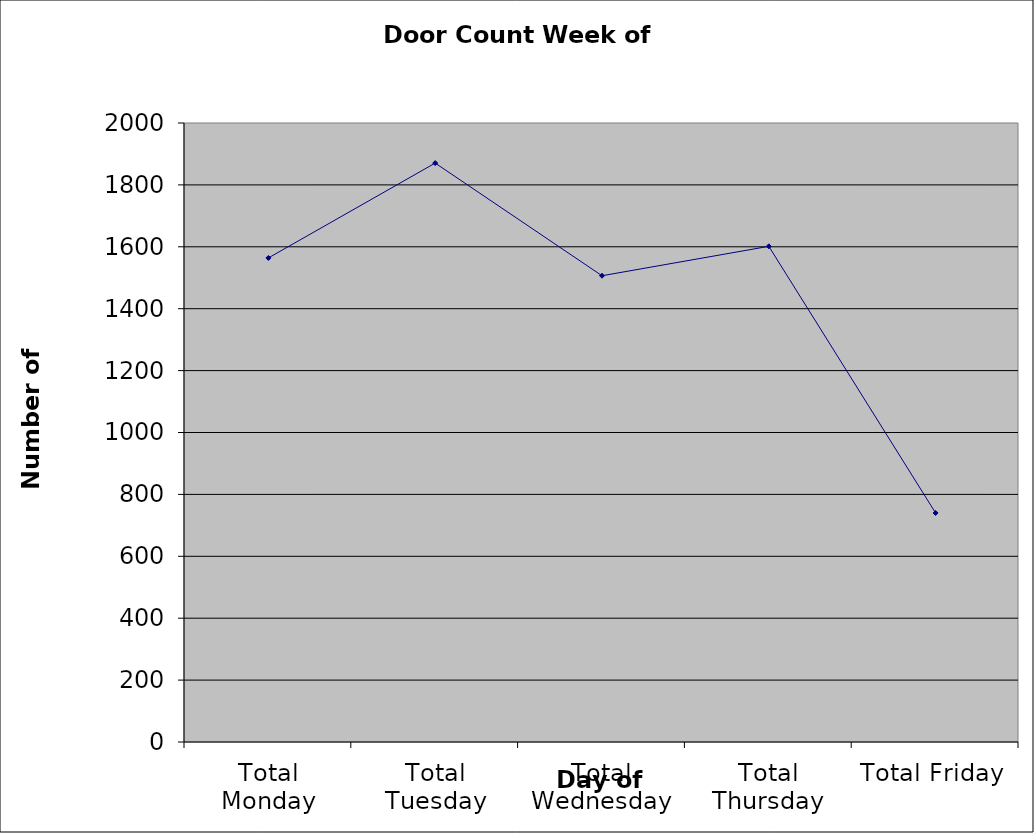
| Category | Series 0 |
|---|---|
| Total Monday | 1564 |
| Total Tuesday | 1870.5 |
| Total Wednesday | 1506.5 |
| Total Thursday | 1601.5 |
| Total Friday | 740 |